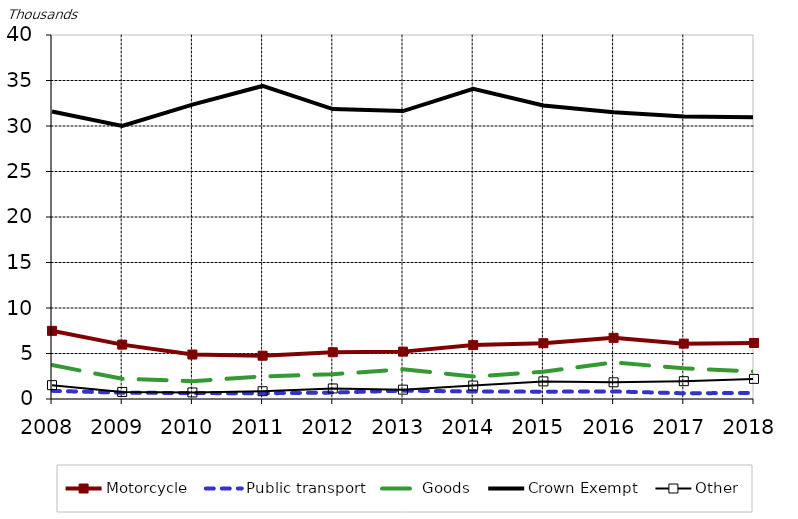
| Category | Motorcycle | Public transport | Goods | Crown Exempt | Other | Crown revised | Other revised |
|---|---|---|---|---|---|---|---|
| 2008.0 | 7.491 | 0.897 | 3.743 |  |  | 31.585 | 1.521 |
| 2009.0 | 5.976 | 0.691 | 2.219 |  |  | 30.002 | 0.778 |
| 2010.0 | 4.886 | 0.654 | 1.962 |  |  | 32.357 | 0.72 |
| 2011.0 | 4.758 | 0.628 | 2.485 |  |  | 34.4 | 0.856 |
| 2012.0 | 5.139 | 0.704 | 2.72 |  |  | 31.861 | 1.16 |
| 2013.0 | 5.206 | 0.916 | 3.263 |  |  | 31.64 | 1.027 |
| 2014.0 | 5.922 | 0.824 | 2.464 |  |  | 34.078 | 1.476 |
| 2015.0 | 6.13 | 0.806 | 3 |  |  | 32.258 | 1.934 |
| 2016.0 | 6.721 | 0.83 | 4.025 |  |  | 31.509 | 1.836 |
| 2017.0 | 6.085 | 0.63 | 3.369 |  |  | 31.054 | 1.957 |
| 2018.0 | 6.159 | 0.668 | 3.021 |  |  | 30.963 | 2.212 |